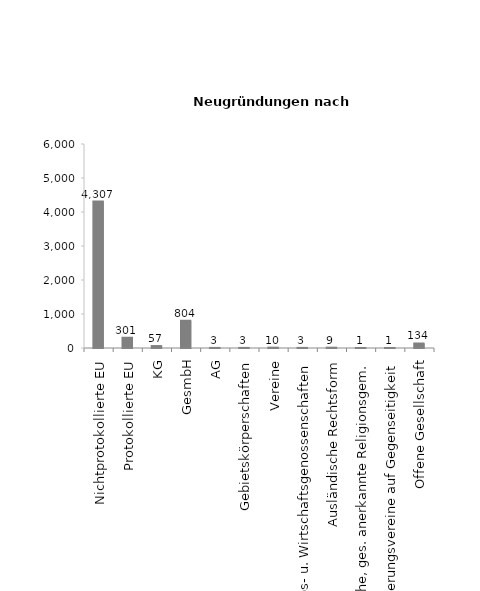
| Category | Series 1 |
|---|---|
| Nichtprotokollierte EU | 4307 |
| Protokollierte EU | 301 |
| KG | 57 |
| GesmbH | 804 |
| AG | 3 |
| Gebietskörperschaften | 3 |
| Vereine | 10 |
| Erwerbs- u. Wirtschaftsgenossenschaften | 3 |
| Ausländische Rechtsform | 9 |
| Kirche, ges. anerkannte Religionsgem. | 1 |
| Versicherungsvereine auf Gegenseitigkeit | 1 |
| Offene Gesellschaft | 134 |